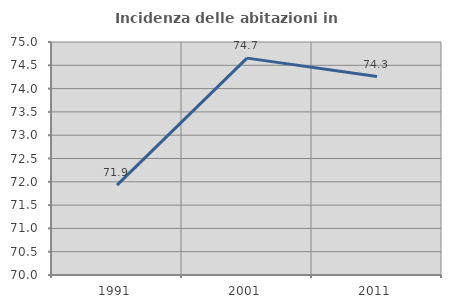
| Category | Incidenza delle abitazioni in proprietà  |
|---|---|
| 1991.0 | 71.929 |
| 2001.0 | 74.654 |
| 2011.0 | 74.258 |